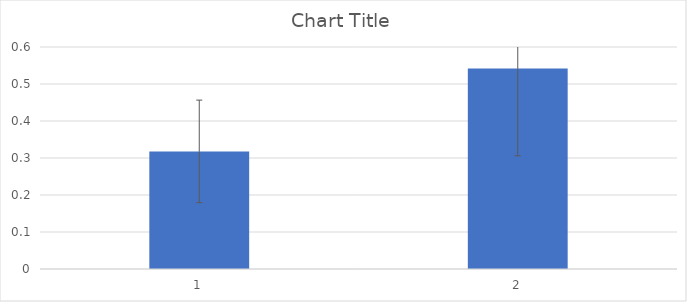
| Category | Series 0 |
|---|---|
| 0 | 0.318 |
| 1 | 0.542 |